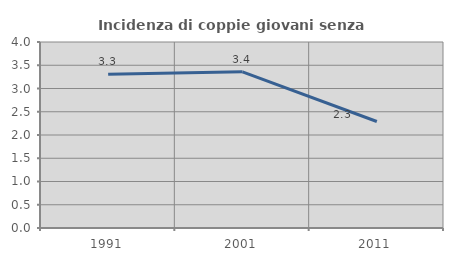
| Category | Incidenza di coppie giovani senza figli |
|---|---|
| 1991.0 | 3.307 |
| 2001.0 | 3.358 |
| 2011.0 | 2.29 |